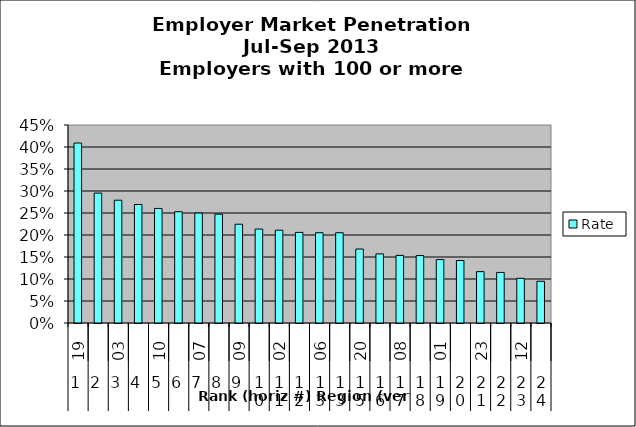
| Category | Rate |
|---|---|
| 0 | 0.409 |
| 1 | 0.295 |
| 2 | 0.279 |
| 3 | 0.269 |
| 4 | 0.26 |
| 5 | 0.253 |
| 6 | 0.25 |
| 7 | 0.247 |
| 8 | 0.224 |
| 9 | 0.213 |
| 10 | 0.211 |
| 11 | 0.206 |
| 12 | 0.205 |
| 13 | 0.205 |
| 14 | 0.168 |
| 15 | 0.157 |
| 16 | 0.154 |
| 17 | 0.153 |
| 18 | 0.144 |
| 19 | 0.142 |
| 20 | 0.117 |
| 21 | 0.115 |
| 22 | 0.102 |
| 23 | 0.095 |